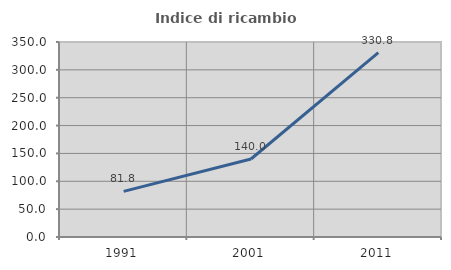
| Category | Indice di ricambio occupazionale  |
|---|---|
| 1991.0 | 81.818 |
| 2001.0 | 140 |
| 2011.0 | 330.769 |